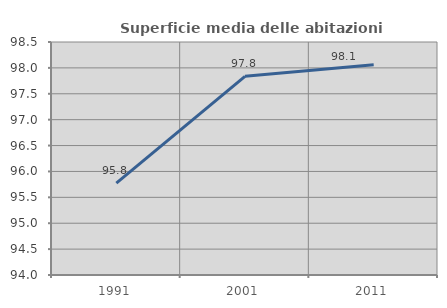
| Category | Superficie media delle abitazioni occupate |
|---|---|
| 1991.0 | 95.774 |
| 2001.0 | 97.838 |
| 2011.0 | 98.059 |